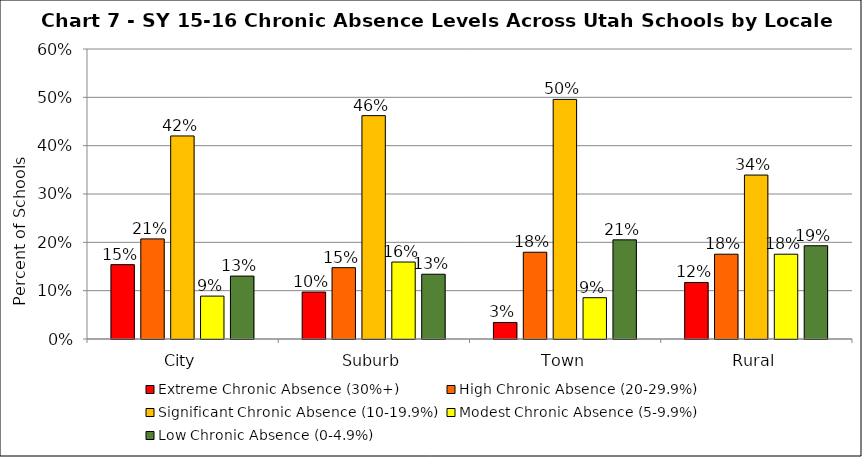
| Category | Extreme Chronic Absence (30%+) | High Chronic Absence (20-29.9%) | Significant Chronic Absence (10-19.9%) | Modest Chronic Absence (5-9.9%) | Low Chronic Absence (0-4.9%) |
|---|---|---|---|---|---|
| 0 | 0.154 | 0.207 | 0.42 | 0.089 | 0.13 |
| 1 | 0.097 | 0.148 | 0.462 | 0.159 | 0.134 |
| 2 | 0.034 | 0.179 | 0.496 | 0.085 | 0.205 |
| 3 | 0.117 | 0.175 | 0.339 | 0.175 | 0.193 |